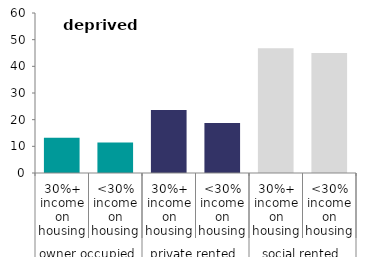
| Category | deprived areas |
|---|---|
| 0 | 13.196 |
| 1 | 11.465 |
| 2 | 23.582 |
| 3 | 18.725 |
| 4 | 46.821 |
| 5 | 45.035 |